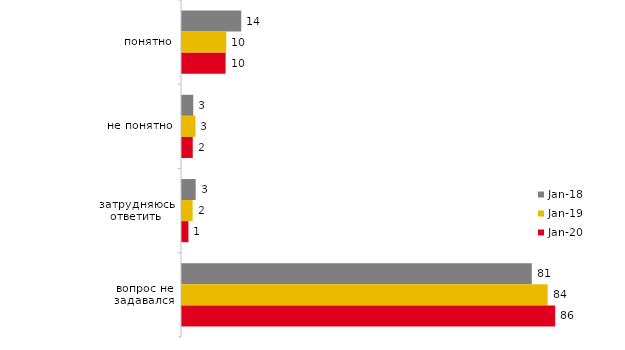
| Category | янв.18 | янв.19 | янв.20 |
|---|---|---|---|
| понятно | 13.65 | 10.2 | 10.05 |
| не понятно | 2.6 | 3.1 | 2.475 |
| затрудняюсь ответить | 3.15 | 2.45 | 1.485 |
| вопрос не задавался | 80.6 | 84.25 | 85.99 |